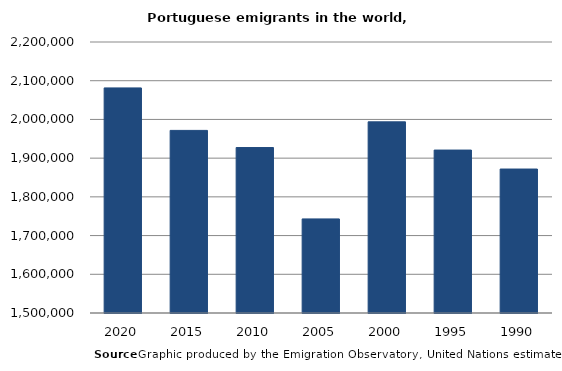
| Category | Series 0 |
|---|---|
| 2020.0 | 2081419 |
| 2015.0 | 1971655 |
| 2010.0 | 1927397 |
| 2005.0 | 1743009 |
| 2000.0 | 1993793 |
| 1995.0 | 1920865 |
| 1990.0 | 1871869 |